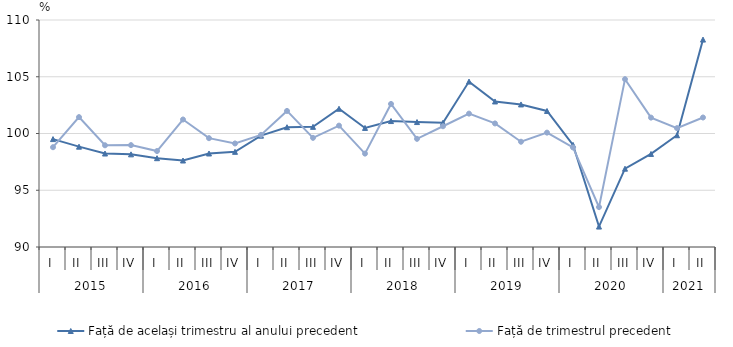
| Category | Față de același trimestru al anului precedent | Față de trimestrul precedent |
|---|---|---|
| 0 | 99.507 | 98.792 |
| 1 | 98.841 | 101.444 |
| 2 | 98.236 | 98.962 |
| 3 | 98.163 | 98.976 |
| 4 | 97.825 | 98.452 |
| 5 | 97.621 | 101.233 |
| 6 | 98.239 | 99.588 |
| 7 | 98.385 | 99.123 |
| 8 | 99.811 | 99.879 |
| 9 | 100.556 | 101.989 |
| 10 | 100.586 | 99.618 |
| 11 | 102.179 | 100.693 |
| 12 | 100.491 | 98.228 |
| 13 | 101.097 | 102.604 |
| 14 | 101.008 | 99.53 |
| 15 | 100.954 | 100.639 |
| 16 | 104.574 | 101.751 |
| 17 | 102.823 | 100.886 |
| 18 | 102.56 | 99.275 |
| 19 | 101.986 | 100.076 |
| 20 | 99 | 98.772 |
| 21 | 91.8 | 93.516 |
| 22 | 96.9 | 104.788 |
| 23 | 98.2 | 101.4 |
| 24 | 99.847 | 100.472 |
| 25 | 108.274 | 101.409 |